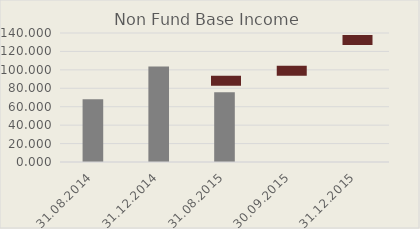
| Category | Non Fund Base Income |
|---|---|
| 31.08.2014 | 68.133 |
| 31.12.2014 | 103.716 |
| 31.08.2015 | 75.644 |
| 30.09.2015 | 0 |
| 31.12.2015 | 0 |